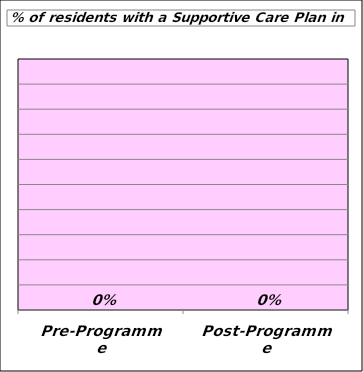
| Category | Yes |
|---|---|
| Pre-Programme | 0 |
| Post-Programme | 0 |